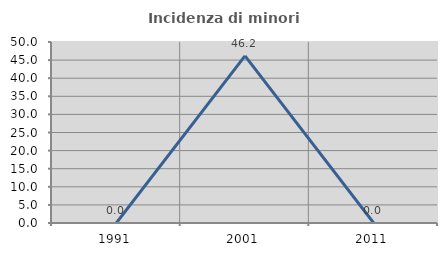
| Category | Incidenza di minori stranieri |
|---|---|
| 1991.0 | 0 |
| 2001.0 | 46.154 |
| 2011.0 | 0 |